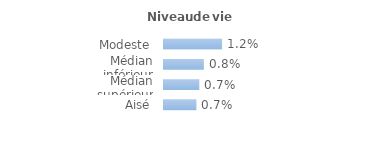
| Category | Series 0 |
|---|---|
| Modeste | 0.012 |
| Médian inférieur | 0.008 |
| Médian supérieur | 0.007 |
| Aisé | 0.007 |